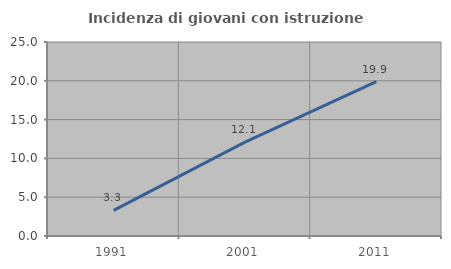
| Category | Incidenza di giovani con istruzione universitaria |
|---|---|
| 1991.0 | 3.311 |
| 2001.0 | 12.106 |
| 2011.0 | 19.884 |